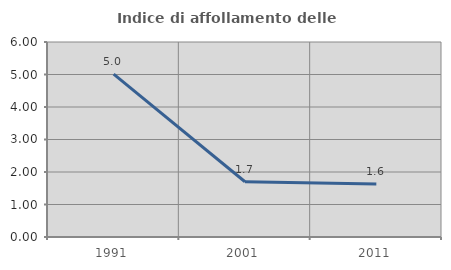
| Category | Indice di affollamento delle abitazioni  |
|---|---|
| 1991.0 | 5.013 |
| 2001.0 | 1.7 |
| 2011.0 | 1.629 |